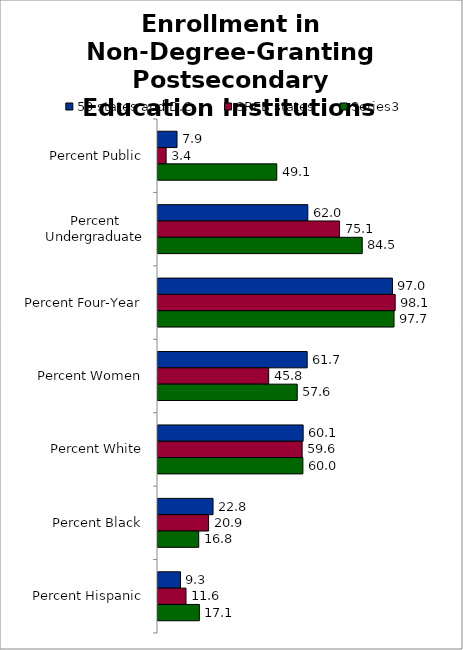
| Category | 50 states and D.C. | SREB states | Series 2 |
|---|---|---|---|
| Percent Public | 7.872 | 3.366 | 49.142 |
| Percent Undergraduate | 61.989 | 75.121 | 84.511 |
| Percent Four-Year | 97.017 | 98.144 | 97.667 |
| Percent Women | 61.737 | 45.803 | 57.616 |
| Percent White | 60.061 | 59.65 | 59.955 |
| Percent Black | 22.778 | 20.936 | 16.849 |
| Percent Hispanic | 9.306 | 11.588 | 17.127 |